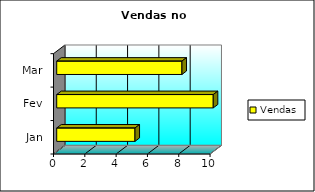
| Category | Vendas |
|---|---|
| Jan | 5 |
| Fev | 10 |
| Mar | 8 |